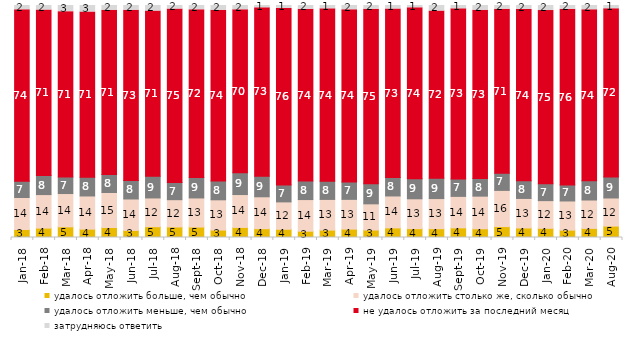
| Category | удалось отложить больше, чем обычно | удалось отложить столько же, сколько обычно | удалось отложить меньше, чем обычно | не удалось отложить за последний месяц | затрудняюсь ответить |
|---|---|---|---|---|---|
| 2018-01-01 | 3.45 | 13.8 | 7 | 73.9 | 1.85 |
| 2018-02-01 | 4.05 | 14.45 | 8.25 | 71.3 | 1.95 |
| 2018-03-01 | 4.6 | 14.35 | 7.1 | 71.3 | 2.65 |
| 2018-04-01 | 3.6 | 14.3 | 8.05 | 71.25 | 2.8 |
| 2018-05-01 | 4.3 | 15.1 | 7.75 | 70.75 | 2.1 |
| 2018-06-01 | 3.05 | 13.55 | 7.95 | 73.4 | 2.05 |
| 2018-07-01 | 4.65 | 12.4 | 9.35 | 71.2 | 2.4 |
| 2018-08-01 | 4.55 | 11.75 | 7.45 | 74.7 | 1.55 |
| 2018-09-01 | 4.5 | 12.55 | 8.8 | 72.3 | 1.85 |
| 2018-10-01 | 3.2 | 13.05 | 8.05 | 73.6 | 2.1 |
| 2018-11-01 | 4.341 | 14.172 | 9.381 | 70.259 | 1.846 |
| 2018-12-01 | 3.8 | 13.75 | 8.9 | 72.55 | 1 |
| 2019-01-01 | 3.55 | 11.8 | 7.25 | 76.1 | 1.3 |
| 2019-02-01 | 2.7 | 13.65 | 7.95 | 74.05 | 1.65 |
| 2019-03-01 | 3.182 | 13.227 | 7.857 | 74.291 | 1.442 |
| 2019-04-01 | 3.614 | 12.822 | 7.475 | 74.257 | 1.832 |
| 2019-05-01 | 3.219 | 11.293 | 8.618 | 75.285 | 1.585 |
| 2019-06-01 | 4.14 | 13.766 | 7.93 | 72.668 | 1.496 |
| 2019-07-01 | 3.812 | 12.871 | 8.663 | 73.663 | 0.99 |
| 2019-08-01 | 3.796 | 12.987 | 8.791 | 72.028 | 2.398 |
| 2019-09-01 | 4.158 | 13.564 | 7.475 | 73.366 | 1.436 |
| 2019-10-01 | 3.762 | 14.059 | 7.574 | 72.525 | 2.079 |
| 2019-11-01 | 4.703 | 15.594 | 7.376 | 70.743 | 1.584 |
| 2019-12-01 | 4.109 | 12.723 | 7.624 | 73.812 | 1.733 |
| 2020-01-01 | 3.96 | 11.931 | 7.228 | 74.703 | 2.178 |
| 2020-02-01 | 3.168 | 12.574 | 6.931 | 75.693 | 1.634 |
| 2020-03-01 | 3.917 | 12.246 | 8.28 | 73.723 | 1.834 |
| 2020-08-01 | 4.916 | 12.115 | 9.086 | 72.493 | 1.39 |